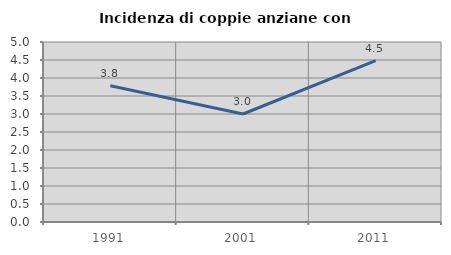
| Category | Incidenza di coppie anziane con figli |
|---|---|
| 1991.0 | 3.787 |
| 2001.0 | 3 |
| 2011.0 | 4.483 |